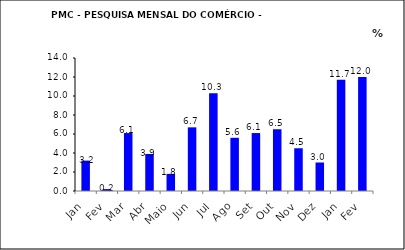
| Category | Series 0 |
|---|---|
| Jan | 3.2 |
| Fev | 0.2 |
| Mar | 6.1 |
| Abr | 3.9 |
| Maio | 1.8 |
| Jun | 6.7 |
| Jul | 10.3 |
| Ago | 5.6 |
| Set | 6.1 |
| Out | 6.5 |
| Nov | 4.5 |
| Dez | 3 |
| Jan | 11.7 |
| Fev | 12 |